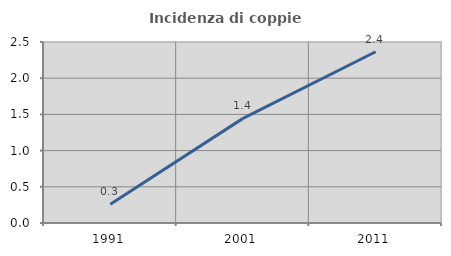
| Category | Incidenza di coppie miste |
|---|---|
| 1991.0 | 0.259 |
| 2001.0 | 1.445 |
| 2011.0 | 2.366 |